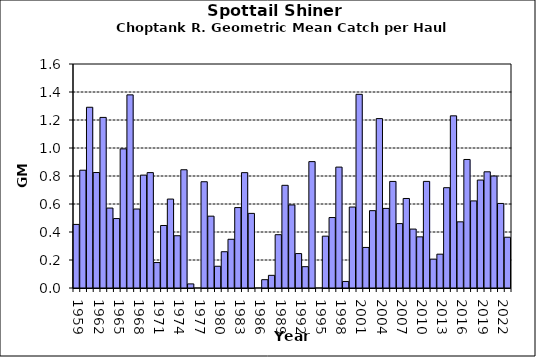
| Category | Series 0 |
|---|---|
| 1959.0 | 0.454 |
| 1960.0 | 0.841 |
| 1961.0 | 1.291 |
| 1962.0 | 0.825 |
| 1963.0 | 1.218 |
| 1964.0 | 0.571 |
| 1965.0 | 0.496 |
| 1966.0 | 0.994 |
| 1967.0 | 1.38 |
| 1968.0 | 0.564 |
| 1969.0 | 0.806 |
| 1970.0 | 0.824 |
| 1971.0 | 0.182 |
| 1972.0 | 0.446 |
| 1973.0 | 0.635 |
| 1974.0 | 0.373 |
| 1975.0 | 0.845 |
| 1976.0 | 0.029 |
| 1977.0 | 0 |
| 1978.0 | 0.759 |
| 1979.0 | 0.513 |
| 1980.0 | 0.155 |
| 1981.0 | 0.259 |
| 1982.0 | 0.348 |
| 1983.0 | 0.574 |
| 1984.0 | 0.824 |
| 1985.0 | 0.533 |
| 1986.0 | 0 |
| 1987.0 | 0.059 |
| 1988.0 | 0.091 |
| 1989.0 | 0.381 |
| 1990.0 | 0.733 |
| 1991.0 | 0.593 |
| 1992.0 | 0.246 |
| 1993.0 | 0.152 |
| 1994.0 | 0.903 |
| 1995.0 | 0 |
| 1996.0 | 0.37 |
| 1997.0 | 0.503 |
| 1998.0 | 0.864 |
| 1999.0 | 0.047 |
| 2000.0 | 0.578 |
| 2001.0 | 1.383 |
| 2002.0 | 0.29 |
| 2003.0 | 0.552 |
| 2004.0 | 1.21 |
| 2005.0 | 0.569 |
| 2006.0 | 0.761 |
| 2007.0 | 0.46 |
| 2008.0 | 0.639 |
| 2009.0 | 0.421 |
| 2010.0 | 0.365 |
| 2011.0 | 0.761 |
| 2012.0 | 0.206 |
| 2013.0 | 0.242 |
| 2014.0 | 0.716 |
| 2015.0 | 1.23 |
| 2016.0 | 0.473 |
| 2017.0 | 0.918 |
| 2018.0 | 0.622 |
| 2019.0 | 0.771 |
| 2020.0 | 0.83 |
| 2021.0 | 0.8 |
| 2022.0 | 0.604 |
| 2023.0 | 0.363 |